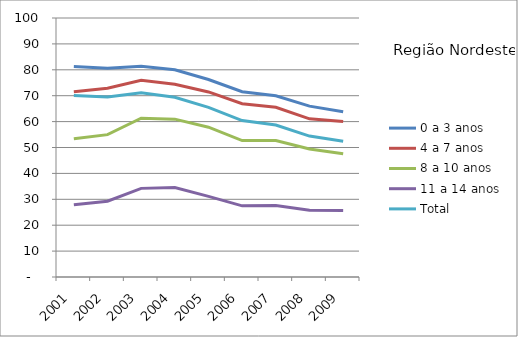
| Category | 0 a 3 anos | 4 a 7 anos | 8 a 10 anos | 11 a 14 anos | Total |
|---|---|---|---|---|---|
| 2001.0 | 81.26 | 71.57 | 53.42 | 27.89 | 70.06 |
| 2002.0 | 80.61 | 72.87 | 54.97 | 29.26 | 69.48 |
| 2003.0 | 81.4 | 75.92 | 61.32 | 34.22 | 71.16 |
| 2004.0 | 79.99 | 74.45 | 60.95 | 34.51 | 69.38 |
| 2005.0 | 76.25 | 71.46 | 57.83 | 31.14 | 65.52 |
| 2006.0 | 71.54 | 66.88 | 52.68 | 27.48 | 60.39 |
| 2007.0 | 69.95 | 65.55 | 52.7 | 27.64 | 58.66 |
| 2008.0 | 65.98 | 61.06 | 49.43 | 25.8 | 54.4 |
| 2009.0 | 63.78 | 60.07 | 47.58 | 25.64 | 52.39 |